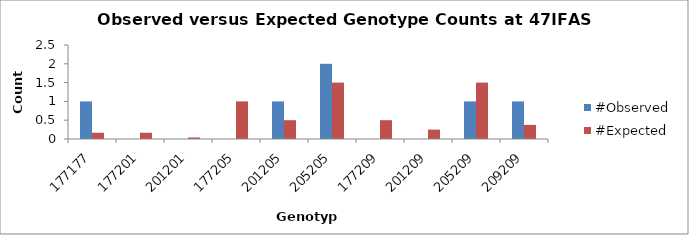
| Category | #Observed | #Expected |
|---|---|---|
| 177177.0 | 1 | 0.167 |
| 177201.0 | 0 | 0.167 |
| 201201.0 | 0 | 0.042 |
| 177205.0 | 0 | 1 |
| 201205.0 | 1 | 0.5 |
| 205205.0 | 2 | 1.5 |
| 177209.0 | 0 | 0.5 |
| 201209.0 | 0 | 0.25 |
| 205209.0 | 1 | 1.5 |
| 209209.0 | 1 | 0.375 |